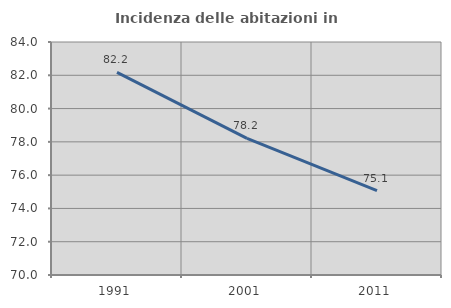
| Category | Incidenza delle abitazioni in proprietà  |
|---|---|
| 1991.0 | 82.175 |
| 2001.0 | 78.209 |
| 2011.0 | 75.075 |